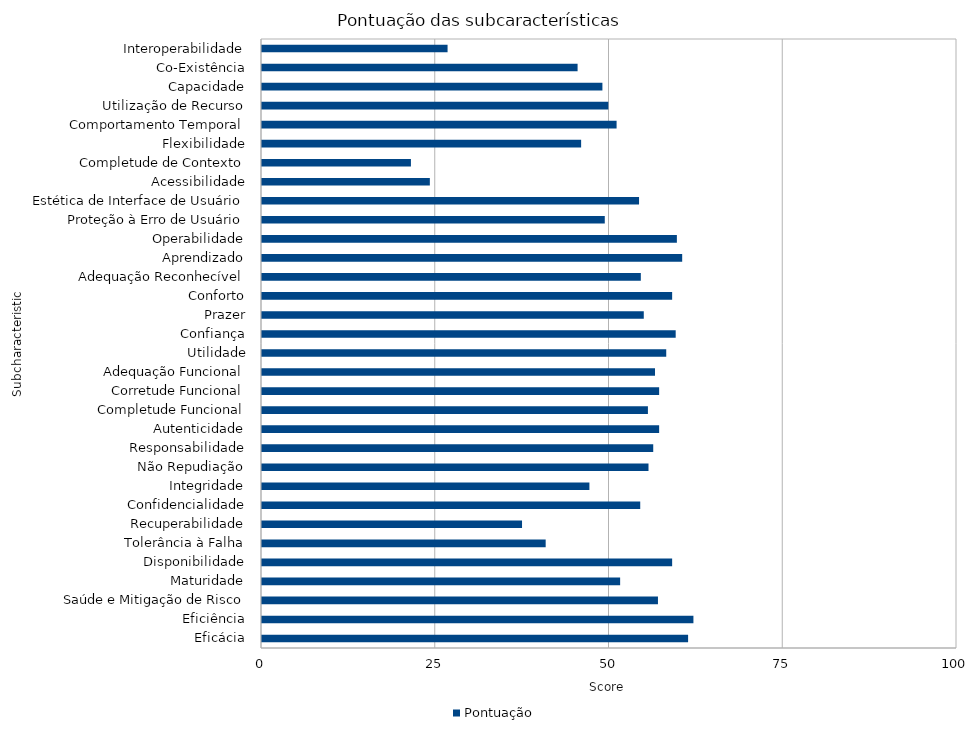
| Category | Pontuação |
|---|---|
| Eficácia | 61.31 |
| Eficiência | 62.075 |
| Saúde e Mitigação de Risco | 56.973 |
| Maturidade | 51.531 |
| Disponibilidade | 59.014 |
| Tolerância à Falha | 40.816 |
| Recuperabilidade | 37.415 |
| Confidencialidade | 54.422 |
| Integridade | 47.109 |
| Não Repudiação | 55.612 |
| Responsabilidade | 56.293 |
| Autenticidade | 57.143 |
| Completude Funcional | 55.527 |
| Corretude Funcional | 57.143 |
| Adequação Funcional | 56.548 |
| Utilidade | 58.163 |
| Confiança | 59.524 |
| Prazer | 54.932 |
| Conforto | 59.014 |
| Adequação Reconhecível | 54.507 |
| Aprendizado | 60.459 |
| Operabilidade | 59.694 |
| Proteção à Erro de Usuário | 49.32 |
| Estética de Interface de Usuário | 54.252 |
| Acessibilidade | 24.15 |
| Completude de Contexto | 21.429 |
| Flexibilidade | 45.918 |
| Comportamento Temporal | 51.02 |
| Utilização de Recurso | 49.83 |
| Capacidade | 48.98 |
| Co-Existência | 45.408 |
| Interoperabilidade | 26.701 |